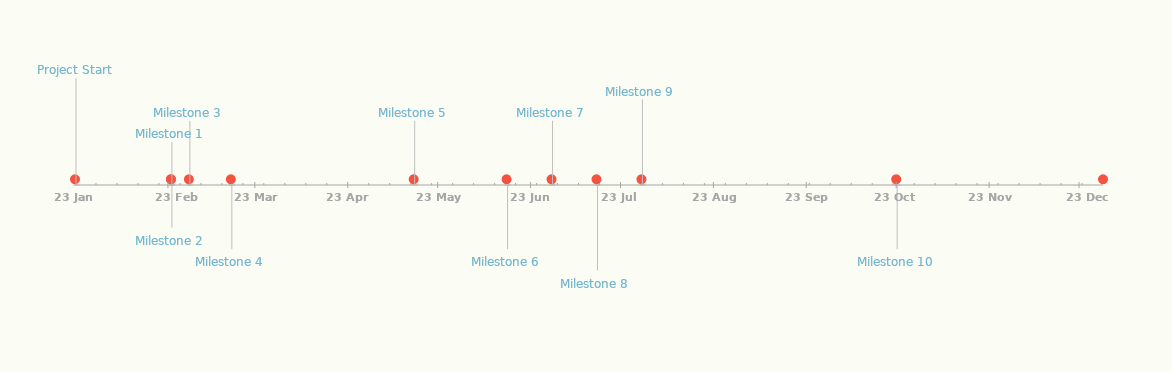
| Category | POSITION |
|---|---|
| Project Start | 25 |
| Milestone 1 | 10 |
| Milestone 2 | -10 |
| Milestone 3 | 15 |
| Milestone 4 | -15 |
| Milestone 5 | 15 |
| Milestone 6 | -15 |
| Milestone 7 | 15 |
| Milestone 8 | -20 |
| Milestone 9 | 20 |
| Milestone 10 | -15 |
| Project End | 15 |